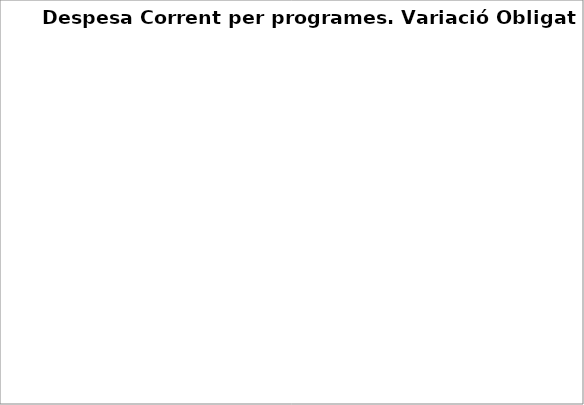
| Category | Series 0 |
|---|---|
| Deute Públic | -0.32 |
| Serveis públics bàsics | 0.102 |
| Actuacions de protecció i promoció social | -0.235 |
| Béns públics de caràcter preferent | 0.157 |
| Actuacions de caràcter econòmic | 1.192 |
| Actuacions de caràcter general | 0.272 |